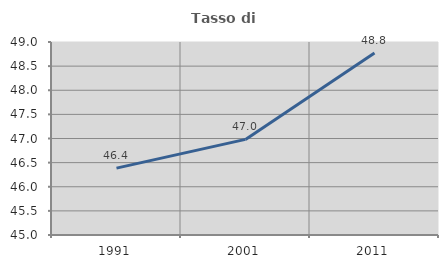
| Category | Tasso di occupazione   |
|---|---|
| 1991.0 | 46.386 |
| 2001.0 | 46.981 |
| 2011.0 | 48.77 |